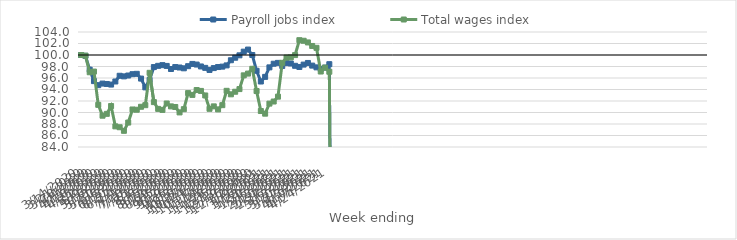
| Category | Payroll jobs index | Total wages index |
|---|---|---|
| 14/03/2020 | 100 | 100 |
| 21/03/2020 | 99.854 | 99.886 |
| 28/03/2020 | 97.447 | 97 |
| 04/04/2020 | 95.459 | 97.118 |
| 11/04/2020 | 94.755 | 91.334 |
| 18/04/2020 | 95.031 | 89.443 |
| 25/04/2020 | 94.961 | 89.766 |
| 02/05/2020 | 94.856 | 91.123 |
| 09/05/2020 | 95.393 | 87.588 |
| 16/05/2020 | 96.388 | 87.436 |
| 23/05/2020 | 96.285 | 86.815 |
| 30/05/2020 | 96.431 | 88.248 |
| 06/06/2020 | 96.663 | 90.524 |
| 13/06/2020 | 96.724 | 90.483 |
| 20/06/2020 | 95.899 | 90.996 |
| 27/06/2020 | 94.37 | 91.273 |
| 04/07/2020 | 95.662 | 96.9 |
| 11/07/2020 | 97.901 | 91.807 |
| 18/07/2020 | 98.115 | 90.628 |
| 25/07/2020 | 98.234 | 90.454 |
| 01/08/2020 | 98.099 | 91.568 |
| 08/08/2020 | 97.563 | 91.065 |
| 15/08/2020 | 97.902 | 90.959 |
| 22/08/2020 | 97.825 | 90.014 |
| 29/08/2020 | 97.685 | 90.576 |
| 05/09/2020 | 98.056 | 93.374 |
| 12/09/2020 | 98.447 | 93.062 |
| 19/09/2020 | 98.339 | 93.908 |
| 26/09/2020 | 98.006 | 93.754 |
| 03/10/2020 | 97.763 | 92.963 |
| 10/10/2020 | 97.4 | 90.643 |
| 17/10/2020 | 97.725 | 91.068 |
| 24/10/2020 | 97.907 | 90.54 |
| 31/10/2020 | 97.976 | 91.277 |
| 07/11/2020 | 98.192 | 93.77 |
| 14/11/2020 | 99.088 | 93.161 |
| 21/11/2020 | 99.526 | 93.609 |
| 28/11/2020 | 99.944 | 94.071 |
| 05/12/2020 | 100.582 | 96.46 |
| 12/12/2020 | 100.946 | 96.768 |
| 19/12/2020 | 99.999 | 97.603 |
| 26/12/2020 | 97.255 | 93.736 |
| 02/01/2021 | 95.39 | 90.258 |
| 09/01/2021 | 96.196 | 89.799 |
| 16/01/2021 | 97.85 | 91.547 |
| 23/01/2021 | 98.481 | 91.91 |
| 30/01/2021 | 98.63 | 92.754 |
| 06/02/2021 | 98.097 | 98.64 |
| 13/02/2021 | 98.594 | 99.551 |
| 20/02/2021 | 98.523 | 99.593 |
| 27/02/2021 | 98.12 | 99.988 |
| 06/03/2021 | 97.918 | 102.579 |
| 13/03/2021 | 98.33 | 102.477 |
| 20/03/2021 | 98.617 | 102.187 |
| 27/03/2021 | 98.156 | 101.571 |
| 03/04/2021 | 97.852 | 101.246 |
| 10/04/2021 | 97.58 | 97.128 |
| 17/04/2021 | 97.809 | 97.808 |
| 24/04/2021 | 98.401 | 97.089 |